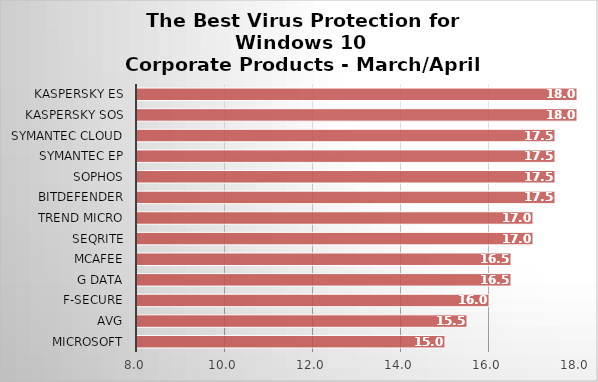
| Category | Series 0 |
|---|---|
| Microsoft | 15 |
| AVG | 15.5 |
| F-Secure | 16 |
| G Data | 16.5 |
| McAfee | 16.5 |
| Seqrite | 17 |
| Trend Micro | 17 |
| Bitdefender | 17.5 |
| Sophos | 17.5 |
| Symantec EP | 17.5 |
| Symantec Cloud | 17.5 |
| Kaspersky SOS | 18 |
| Kaspersky ES | 18 |